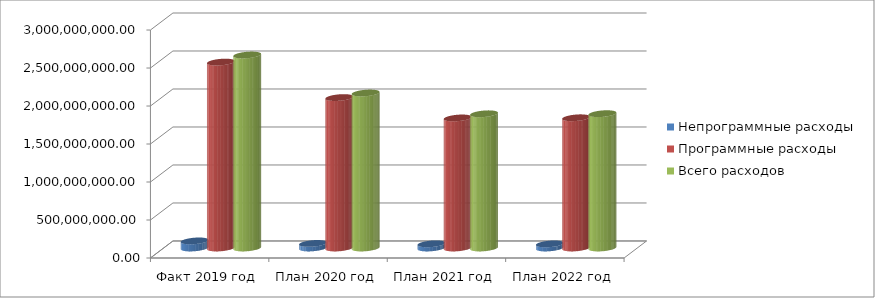
| Category | Непрограммные расходы | Программные расходы | Всего расходов |
|---|---|---|---|
| Факт 2019 год | 93276865.45 | 2446468858.11 | 2539745723.56 |
| План 2020 год | 60165110 | 1979656490 | 2039821600 |
| План 2021 год | 54917160 | 1711346940 | 1766264100 |
| План 2022 год | 53886860 | 1713784540 | 1767671400 |